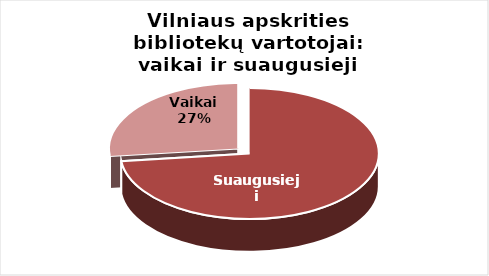
| Category | Series 0 |
|---|---|
| Suaugusieji | 81769 |
| Vaikai | 30032 |